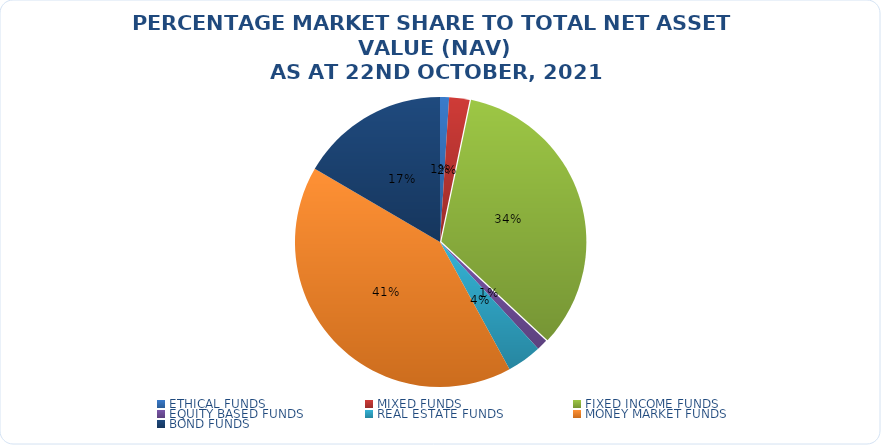
| Category | NET ASSET VALUE |
|---|---|
| ETHICAL FUNDS | 13000453217.595 |
| MIXED FUNDS | 29371112964.311 |
| FIXED INCOME FUNDS | 434511782166.295 |
| EQUITY BASED FUNDS | 15968016571.87 |
| REAL ESTATE FUNDS | 50051324785.8 |
| MONEY MARKET FUNDS | 534163471340.03 |
| BOND FUNDS | 214171900863.892 |